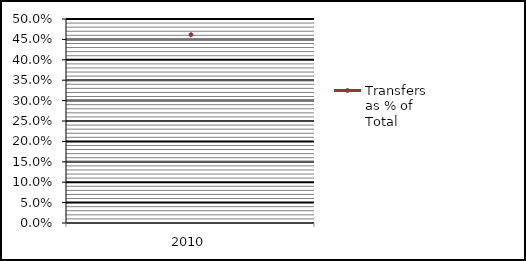
| Category | Transfers as % of Total |
|---|---|
| 2010.0 | 0.461 |